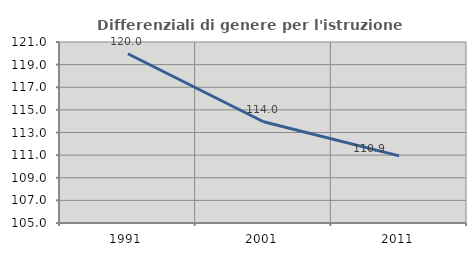
| Category | Differenziali di genere per l'istruzione superiore |
|---|---|
| 1991.0 | 119.96 |
| 2001.0 | 113.953 |
| 2011.0 | 110.934 |